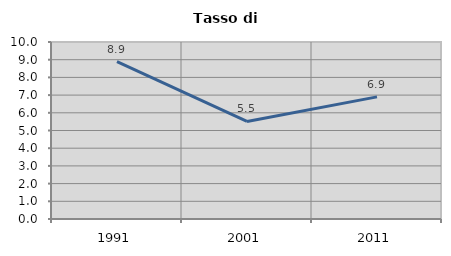
| Category | Tasso di disoccupazione   |
|---|---|
| 1991.0 | 8.891 |
| 2001.0 | 5.512 |
| 2011.0 | 6.899 |